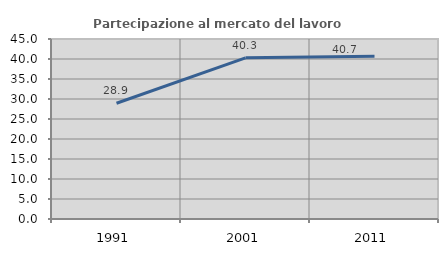
| Category | Partecipazione al mercato del lavoro  femminile |
|---|---|
| 1991.0 | 28.947 |
| 2001.0 | 40.299 |
| 2011.0 | 40.678 |